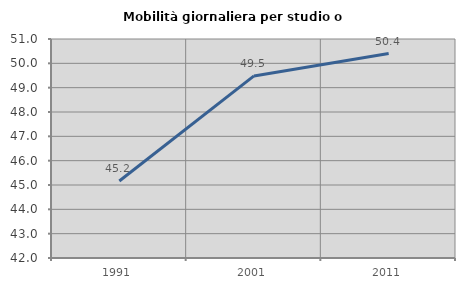
| Category | Mobilità giornaliera per studio o lavoro |
|---|---|
| 1991.0 | 45.166 |
| 2001.0 | 49.482 |
| 2011.0 | 50.401 |